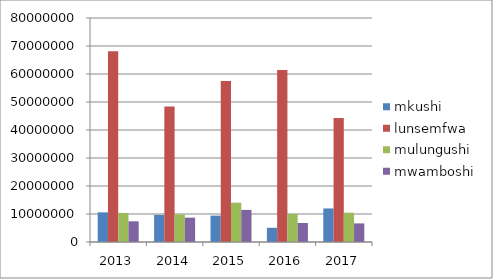
| Category | mkushi | lunsemfwa | mulungushi | mwamboshi |
|---|---|---|---|---|
| 2013.0 | 10586400 | 68119300 | 10393800 | 7388400 |
| 2014.0 | 9664000 | 48363000 | 9870000 | 8698800 |
| 2015.0 | 9422933.333 | 57482800 | 14041600 | 11460000 |
| 2016.0 | 5078750 | 61470000 | 10040100 | 6778100 |
| 2017.0 | 11985600 | 44268200 | 10469600 | 6643000 |